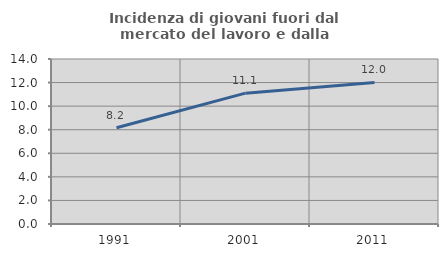
| Category | Incidenza di giovani fuori dal mercato del lavoro e dalla formazione  |
|---|---|
| 1991.0 | 8.161 |
| 2001.0 | 11.102 |
| 2011.0 | 12.015 |